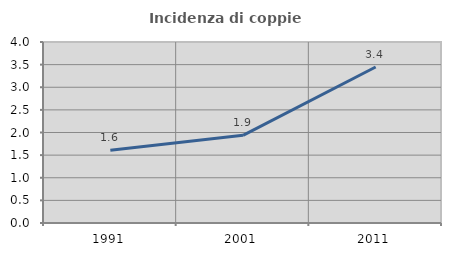
| Category | Incidenza di coppie miste |
|---|---|
| 1991.0 | 1.606 |
| 2001.0 | 1.938 |
| 2011.0 | 3.448 |